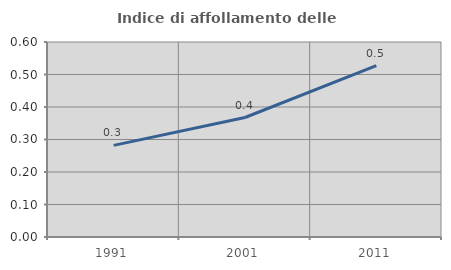
| Category | Indice di affollamento delle abitazioni  |
|---|---|
| 1991.0 | 0.282 |
| 2001.0 | 0.368 |
| 2011.0 | 0.528 |